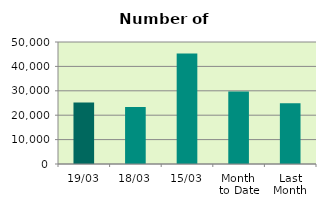
| Category | Series 0 |
|---|---|
| 19/03 | 25196 |
| 18/03 | 23368 |
| 15/03 | 45258 |
| Month 
to Date | 29752 |
| Last
Month | 24872.2 |